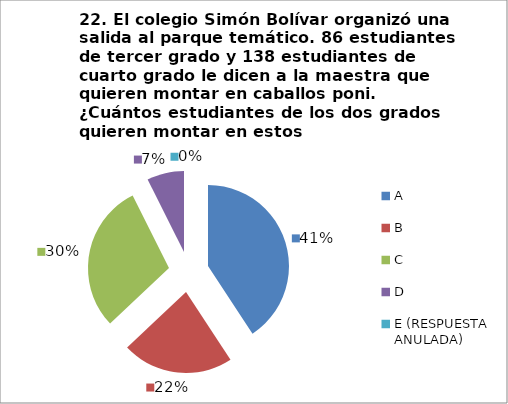
| Category | CANTIDAD DE RESPUESTAS PREGUNTA (22) | PORCENTAJE |
|---|---|---|
| A | 11 | 0.407 |
| B | 6 | 0.222 |
| C | 8 | 0.296 |
| D | 2 | 0.074 |
| E (RESPUESTA ANULADA) | 0 | 0 |